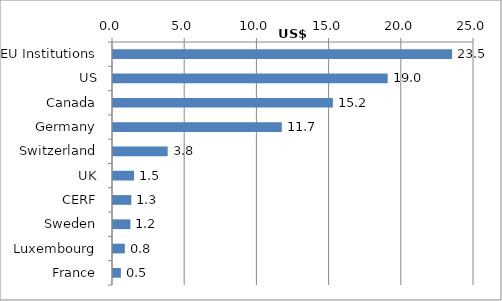
| Category | US$ millions |
|---|---|
| EU Institutions | 23.483 |
| US | 19.022 |
| Canada | 15.228 |
| Germany | 11.69 |
| Switzerland | 3.787 |
| UK | 1.46 |
| CERF | 1.268 |
| Sweden | 1.205 |
| Luxembourg | 0.82 |
| France | 0.546 |